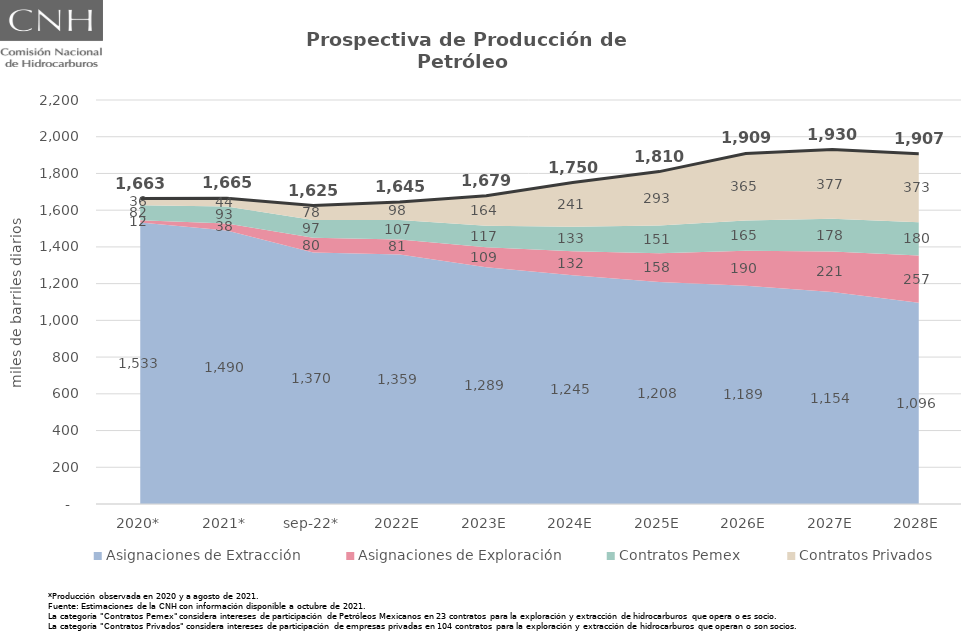
| Category | Total |
|---|---|
| 2020* | 1663.067 |
| 2021* | 1664.715 |
| sep-22* | 1625.017 |
| 2022E | 1644.886 |
| 2023E | 1678.556 |
| 2024E | 1750.398 |
| 2025E | 1810.029 |
| 2026E | 1908.851 |
| 2027E | 1930.284 |
| 2028E | 1907.342 |